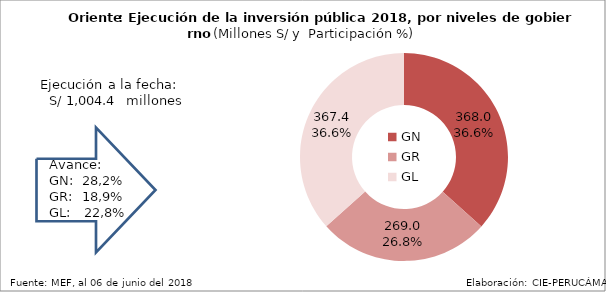
| Category | Ejecutado |
|---|---|
| GN | 367.99 |
| GR | 269 |
| GL | 367.397 |